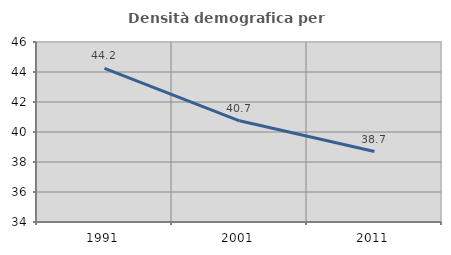
| Category | Densità demografica |
|---|---|
| 1991.0 | 44.244 |
| 2001.0 | 40.747 |
| 2011.0 | 38.698 |